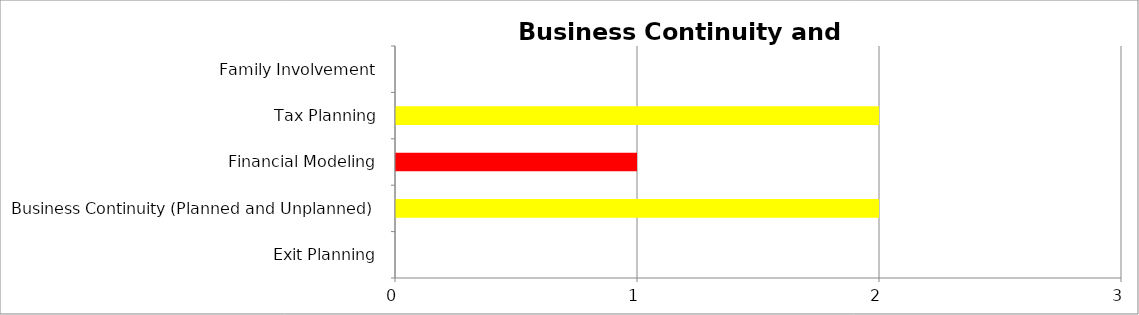
| Category | Series 0 | Series 1 | Series 2 |
|---|---|---|---|
| Exit Planning | 0 | 0 | 0 |
| Business Continuity (Planned and Unplanned) | 0 | 2 | 0 |
| Financial Modeling | 0 | 0 | 1 |
| Tax Planning | 0 | 2 | 0 |
| Family Involvement | 0 | 0 | 0 |